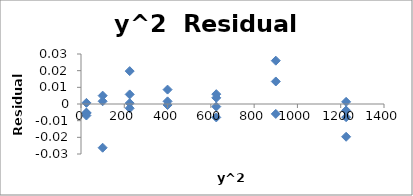
| Category | Series 0 |
|---|---|
| 25.0 | -0.007 |
| 225.0 | 0.006 |
| 625.0 | -0.002 |
| 1225.0 | 0.001 |
| 100.0 | -0.026 |
| 400.0 | -0.001 |
| 900.0 | 0.026 |
| 25.0 | -0.006 |
| 225.0 | 0.001 |
| 625.0 | 0.006 |
| 1225.0 | -0.004 |
| 100.0 | 0.002 |
| 400.0 | 0.009 |
| 900.0 | 0.014 |
| 25.0 | -0.005 |
| 225.0 | -0.003 |
| 625.0 | -0.008 |
| 1225.0 | -0.008 |
| 100.0 | 0.005 |
| 400.0 | 0.002 |
| 900.0 | -0.006 |
| 25.0 | 0.001 |
| 225.0 | 0.02 |
| 625.0 | 0.004 |
| 1225.0 | -0.02 |